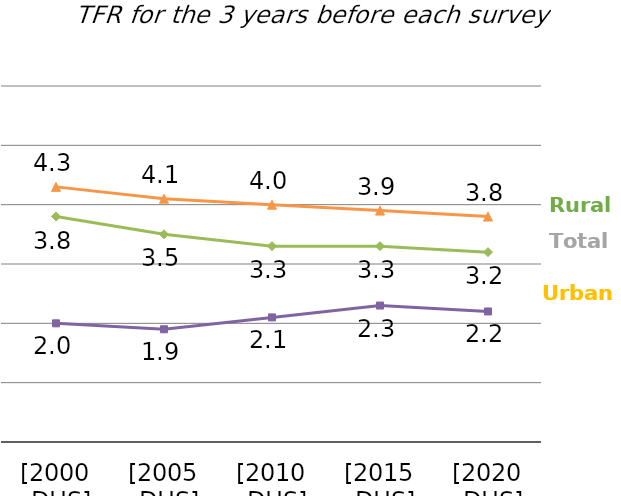
| Category | Total  | Urban | Rural |
|---|---|---|---|
| [2000 xDHS] | 3.8 | 2 | 4.3 |
| [2005 xDHS] | 3.5 | 1.9 | 4.1 |
| [2010 xDHS] | 3.3 | 2.1 | 4 |
| [2015 xDHS] | 3.3 | 2.3 | 3.9 |
| [2020 xDHS] | 3.2 | 2.2 | 3.8 |